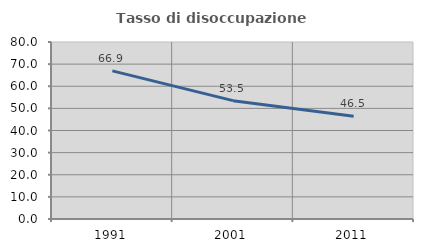
| Category | Tasso di disoccupazione giovanile  |
|---|---|
| 1991.0 | 66.947 |
| 2001.0 | 53.485 |
| 2011.0 | 46.489 |